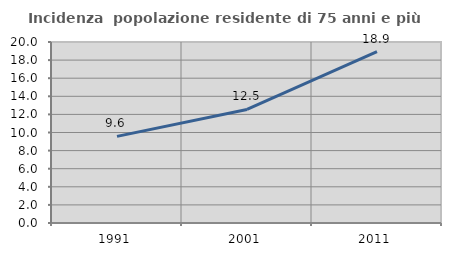
| Category | Incidenza  popolazione residente di 75 anni e più |
|---|---|
| 1991.0 | 9.574 |
| 2001.0 | 12.549 |
| 2011.0 | 18.934 |